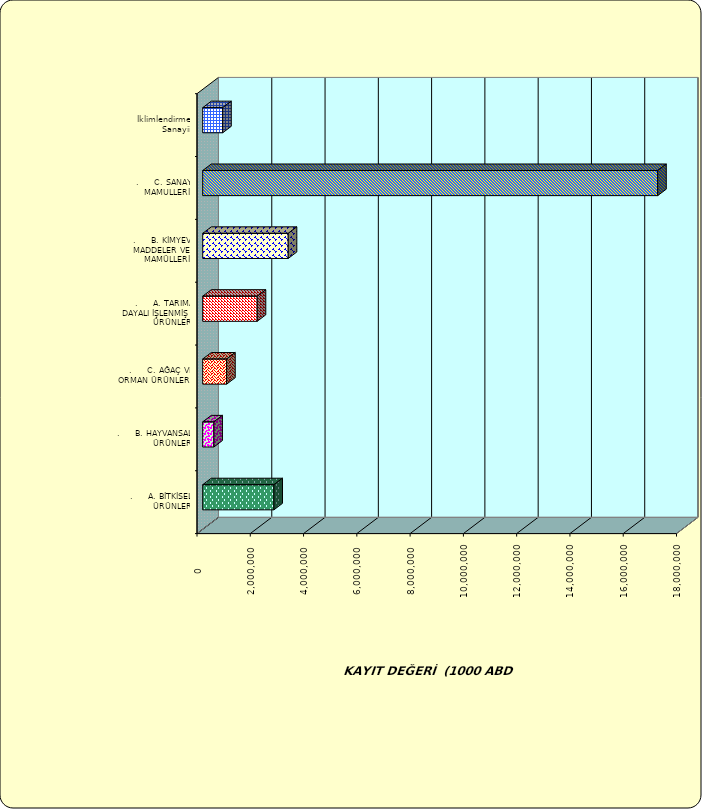
| Category | Series 0 |
|---|---|
| .     A. BİTKİSEL ÜRÜNLER | 2673362.236 |
| .     B. HAYVANSAL ÜRÜNLER | 418911.447 |
| .     C. AĞAÇ VE ORMAN ÜRÜNLERİ | 898615.49 |
| .     A. TARIMA DAYALI İŞLENMİŞ ÜRÜNLER | 2045388.467 |
| .     B. KİMYEVİ MADDELER VE MAMÜLLERİ | 3210453.13 |
| .     C. SANAYİ MAMULLERİ | 17079652.613 |
|  İklimlendirme Sanayii | 750298.323 |